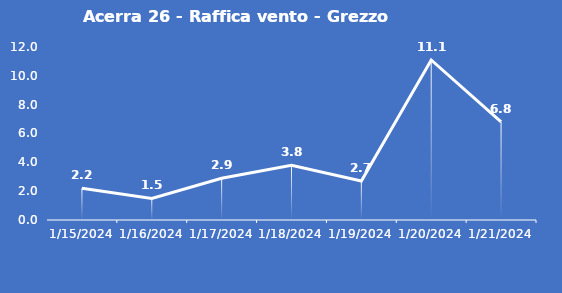
| Category | Acerra 26 - Raffica vento - Grezzo (m/s) |
|---|---|
| 1/15/24 | 2.2 |
| 1/16/24 | 1.5 |
| 1/17/24 | 2.9 |
| 1/18/24 | 3.8 |
| 1/19/24 | 2.7 |
| 1/20/24 | 11.1 |
| 1/21/24 | 6.8 |